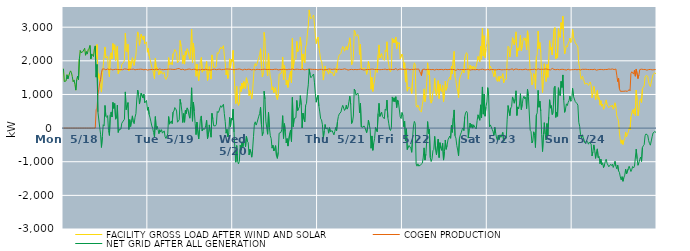
| Category | FACILITY GROSS LOAD AFTER WIND AND SOLAR | COGEN PRODUCTION | NET GRID AFTER ALL GENERATION |
|---|---|---|---|
|  Mon  5/18 | 1765 | 0 | 1765 |
|  Mon  5/18 | 1383 | 0 | 1383 |
|  Mon  5/18 | 1397 | 0 | 1397 |
|  Mon  5/18 | 1404 | 0 | 1404 |
|  Mon  5/18 | 1585 | 0 | 1585 |
|  Mon  5/18 | 1462 | 0 | 1462 |
|  Mon  5/18 | 1553 | 0 | 1553 |
|  Mon  5/18 | 1636 | 0 | 1636 |
|  Mon  5/18 | 1701 | 0 | 1701 |
|  Mon  5/18 | 1654 | 0 | 1654 |
|  Mon  5/18 | 1531 | 0 | 1531 |
|  Mon  5/18 | 1377 | 0 | 1377 |
|  Mon  5/18 | 1432 | 0 | 1432 |
|  Mon  5/18 | 1298 | 0 | 1298 |
|  Mon  5/18 | 1129 | 0 | 1129 |
|  Mon  5/18 | 1440 | 0 | 1440 |
|  Mon  5/18 | 1547 | 0 | 1547 |
|  Mon  5/18 | 1440 | 0 | 1440 |
|  Mon  5/18 | 2053 | 0 | 2053 |
|  Mon  5/18 | 2304 | 0 | 2304 |
|  Mon  5/18 | 2243 | 0 | 2243 |
|  Mon  5/18 | 2216 | 0 | 2216 |
|  Mon  5/18 | 2272 | 0 | 2272 |
|  Mon  5/18 | 2323 | 0 | 2323 |
|  Mon  5/18 | 2374 | 0 | 2374 |
|  Mon  5/18 | 2166 | 0 | 2166 |
|  Mon  5/18 | 2275 | 0 | 2275 |
|  Mon  5/18 | 2200 | 0 | 2200 |
|  Mon  5/18 | 2330 | 0 | 2330 |
|  Mon  5/18 | 2369 | 0 | 2369 |
|  Mon  5/18 | 2455 | 0 | 2455 |
|  Mon  5/18 | 2060 | 0 | 2060 |
|  Mon  5/18 | 2205 | 0 | 2205 |
|  Mon  5/18 | 2228 | 0 | 2228 |
|  Mon  5/18 | 2128 | 0 | 2128 |
|  Mon  5/18 | 2354 | 0 | 2354 |
|  Mon  5/18 | 2443 | 0 | 2443 |
|  Mon  5/18 | 2059 | 545 | 1514 |
|  Mon  5/18 | 2484 | 592 | 1892 |
|  Mon  5/18 | 1484 | 1001 | 483 |
|  Mon  5/18 | 1617 | 1158 | 459 |
|  Mon  5/18 | 1367 | 1338 | 29 |
|  Mon  5/18 | 1261 | 1442 | -181 |
|  Mon  5/18 | 1070 | 1645 | -575 |
|  Mon  5/18 | 1502 | 1757 | -255 |
|  Mon  5/18 | 1853 | 1753 | 100 |
|  Mon  5/18 | 1826 | 1758 | 68 |
|  Mon  5/18 | 2411 | 1738 | 673 |
|  Mon  5/18 | 2084 | 1733 | 351 |
|  Mon  5/18 | 2068 | 1749 | 319 |
|  Mon  5/18 | 2129 | 1758 | 371 |
|  Mon  5/18 | 1675 | 1753 | -78 |
|  Mon  5/18 | 1520 | 1738 | -218 |
|  Mon  5/18 | 2159 | 1764 | 395 |
|  Mon  5/18 | 2240 | 1760 | 480 |
|  Mon  5/18 | 2058 | 1729 | 329 |
|  Mon  5/18 | 2513 | 1750 | 763 |
|  Mon  5/18 | 2324 | 1739 | 585 |
|  Mon  5/18 | 2477 | 1747 | 730 |
|  Mon  5/18 | 2012 | 1749 | 263 |
|  Mon  5/18 | 2033 | 1732 | 301 |
|  Mon  5/18 | 2428 | 1745 | 683 |
|  Mon  5/18 | 1616 | 1744 | -128 |
|  Mon  5/18 | 1699 | 1738 | -39 |
|  Mon  5/18 | 1715 | 1740 | -25 |
|  Mon  5/18 | 1709 | 1740 | -31 |
|  Mon  5/18 | 1894 | 1749 | 145 |
|  Mon  5/18 | 1919 | 1735 | 184 |
|  Mon  5/18 | 1951 | 1754 | 197 |
|  Mon  5/18 | 2022 | 1759 | 263 |
|  Mon  5/18 | 2824 | 1748 | 1076 |
|  Mon  5/18 | 2303 | 1754 | 549 |
|  Mon  5/18 | 2263 | 1739 | 524 |
|  Mon  5/18 | 2498 | 1741 | 757 |
|  Mon  5/18 | 1697 | 1736 | -39 |
|  Mon  5/18 | 2001 | 1749 | 252 |
|  Mon  5/18 | 1773 | 1725 | 48 |
|  Mon  5/18 | 1971 | 1746 | 225 |
|  Mon  5/18 | 2093 | 1729 | 364 |
|  Mon  5/18 | 1930 | 1754 | 176 |
|  Mon  5/18 | 1863 | 1733 | 130 |
|  Mon  5/18 | 2057 | 1732 | 325 |
|  Mon  5/18 | 2175 | 1743 | 432 |
|  Mon  5/18 | 2607 | 1745 | 862 |
|  Mon  5/18 | 2860 | 1730 | 1130 |
|  Mon  5/18 | 2746 | 1746 | 1000 |
|  Mon  5/18 | 2462 | 1747 | 715 |
|  Mon  5/18 | 2468 | 1752 | 716 |
|  Mon  5/18 | 2790 | 1749 | 1041 |
|  Mon  5/18 | 2776 | 1748 | 1028 |
|  Mon  5/18 | 2628 | 1733 | 895 |
|  Mon  5/18 | 2741 | 1733 | 1008 |
|  Mon  5/18 | 2504 | 1752 | 752 |
|  Mon  5/18 | 2475 | 1745 | 730 |
|  Mon  5/18 | 2564 | 1743 | 821 |
|  Mon  5/18 | 2256 | 1726 | 530 |
|  Tue  5/19 | 2371 | 1748 | 623 |
|  Tue  5/19 | 2139 | 1736 | 403 |
|  Tue  5/19 | 2043 | 1740 | 303 |
|  Tue  5/19 | 1925 | 1740 | 185 |
|  Tue  5/19 | 1803 | 1739 | 64 |
|  Tue  5/19 | 1735 | 1745 | -10 |
|  Tue  5/19 | 1611 | 1745 | -134 |
|  Tue  5/19 | 1465 | 1737 | -272 |
|  Tue  5/19 | 2080 | 1739 | 341 |
|  Tue  5/19 | 1715 | 1754 | -39 |
|  Tue  5/19 | 1801 | 1750 | 51 |
|  Tue  5/19 | 1694 | 1738 | -44 |
|  Tue  5/19 | 1582 | 1747 | -165 |
|  Tue  5/19 | 1711 | 1759 | -48 |
|  Tue  5/19 | 1627 | 1746 | -119 |
|  Tue  5/19 | 1693 | 1739 | -46 |
|  Tue  5/19 | 1609 | 1760 | -151 |
|  Tue  5/19 | 1593 | 1737 | -144 |
|  Tue  5/19 | 1655 | 1738 | -83 |
|  Tue  5/19 | 1485 | 1744 | -259 |
|  Tue  5/19 | 1447 | 1755 | -308 |
|  Tue  5/19 | 1434 | 1743 | -309 |
|  Tue  5/19 | 1557 | 1730 | -173 |
|  Tue  5/19 | 2095 | 1752 | 343 |
|  Tue  5/19 | 1875 | 1759 | 116 |
|  Tue  5/19 | 1858 | 1751 | 107 |
|  Tue  5/19 | 1953 | 1741 | 212 |
|  Tue  5/19 | 1880 | 1747 | 133 |
|  Tue  5/19 | 2210 | 1735 | 475 |
|  Tue  5/19 | 2248 | 1742 | 506 |
|  Tue  5/19 | 2336 | 1726 | 610 |
|  Tue  5/19 | 2322 | 1746 | 576 |
|  Tue  5/19 | 2246 | 1739 | 507 |
|  Tue  5/19 | 1940 | 1765 | 175 |
|  Tue  5/19 | 1961 | 1758 | 203 |
|  Tue  5/19 | 2016 | 1769 | 247 |
|  Tue  5/19 | 2602 | 1746 | 856 |
|  Tue  5/19 | 2437 | 1736 | 701 |
|  Tue  5/19 | 2249 | 1745 | 504 |
|  Tue  5/19 | 1918 | 1751 | 167 |
|  Tue  5/19 | 2167 | 1735 | 432 |
|  Tue  5/19 | 1903 | 1729 | 174 |
|  Tue  5/19 | 2285 | 1749 | 536 |
|  Tue  5/19 | 2171 | 1737 | 434 |
|  Tue  5/19 | 2361 | 1760 | 601 |
|  Tue  5/19 | 2306 | 1752 | 554 |
|  Tue  5/19 | 2130 | 1753 | 377 |
|  Tue  5/19 | 2049 | 1755 | 294 |
|  Tue  5/19 | 2379 | 1748 | 631 |
|  Tue  5/19 | 2935 | 1737 | 1198 |
|  Tue  5/19 | 1946 | 1742 | 204 |
|  Tue  5/19 | 2522 | 1747 | 775 |
|  Tue  5/19 | 2259 | 1758 | 501 |
|  Tue  5/19 | 1882 | 1749 | 133 |
|  Tue  5/19 | 1538 | 1732 | -194 |
|  Tue  5/19 | 1902 | 1725 | 177 |
|  Tue  5/19 | 1926 | 1740 | 186 |
|  Tue  5/19 | 1415 | 1737 | -322 |
|  Tue  5/19 | 1709 | 1748 | -39 |
|  Tue  5/19 | 2014 | 1731 | 283 |
|  Tue  5/19 | 2100 | 1739 | 361 |
|  Tue  5/19 | 1661 | 1748 | -87 |
|  Tue  5/19 | 1726 | 1746 | -20 |
|  Tue  5/19 | 1741 | 1736 | 5 |
|  Tue  5/19 | 1702 | 1733 | -31 |
|  Tue  5/19 | 1834 | 1749 | 85 |
|  Tue  5/19 | 1982 | 1750 | 232 |
|  Tue  5/19 | 1418 | 1735 | -317 |
|  Tue  5/19 | 1555 | 1740 | -185 |
|  Tue  5/19 | 1827 | 1732 | 95 |
|  Tue  5/19 | 1635 | 1744 | -109 |
|  Tue  5/19 | 1456 | 1727 | -271 |
|  Tue  5/19 | 2176 | 1737 | 439 |
|  Tue  5/19 | 2024 | 1746 | 278 |
|  Tue  5/19 | 1804 | 1738 | 66 |
|  Tue  5/19 | 1817 | 1751 | 66 |
|  Tue  5/19 | 1806 | 1739 | 67 |
|  Tue  5/19 | 1849 | 1736 | 113 |
|  Tue  5/19 | 2244 | 1751 | 493 |
|  Tue  5/19 | 2209 | 1748 | 461 |
|  Tue  5/19 | 2259 | 1750 | 509 |
|  Tue  5/19 | 2355 | 1753 | 602 |
|  Tue  5/19 | 2407 | 1741 | 666 |
|  Tue  5/19 | 2351 | 1736 | 615 |
|  Tue  5/19 | 2373 | 1732 | 641 |
|  Tue  5/19 | 2450 | 1742 | 708 |
|  Tue  5/19 | 2159 | 1731 | 428 |
|  Tue  5/19 | 1950 | 1751 | 199 |
|  Tue  5/19 | 1583 | 1735 | -152 |
|  Tue  5/19 | 1719 | 1757 | -38 |
|  Tue  5/19 | 1477 | 1740 | -263 |
|  Tue  5/19 | 1595 | 1752 | -157 |
|  Tue  5/19 | 2060 | 1743 | 317 |
|  Tue  5/19 | 1791 | 1751 | 40 |
|  Tue  5/19 | 2043 | 1749 | 294 |
|  Tue  5/19 | 1981 | 1744 | 237 |
|  Wed  5/20 | 2308 | 1747 | 561 |
|  Wed  5/20 | 1620 | 1737 | -117 |
|  Wed  5/20 | 1107 | 1741 | -634 |
|  Wed  5/20 | 729 | 1744 | -1015 |
|  Wed  5/20 | 1238 | 1758 | -520 |
|  Wed  5/20 | 777 | 1750 | -973 |
|  Wed  5/20 | 674 | 1737 | -1063 |
|  Wed  5/20 | 774 | 1758 | -984 |
|  Wed  5/20 | 1237 | 1747 | -510 |
|  Wed  5/20 | 1085 | 1743 | -658 |
|  Wed  5/20 | 1338 | 1747 | -409 |
|  Wed  5/20 | 1173 | 1726 | -553 |
|  Wed  5/20 | 1382 | 1753 | -371 |
|  Wed  5/20 | 1411 | 1751 | -340 |
|  Wed  5/20 | 1176 | 1736 | -560 |
|  Wed  5/20 | 1496 | 1737 | -241 |
|  Wed  5/20 | 1369 | 1756 | -387 |
|  Wed  5/20 | 1317 | 1750 | -433 |
|  Wed  5/20 | 964 | 1762 | -798 |
|  Wed  5/20 | 1116 | 1747 | -631 |
|  Wed  5/20 | 1010 | 1741 | -731 |
|  Wed  5/20 | 866 | 1731 | -865 |
|  Wed  5/20 | 1107 | 1743 | -636 |
|  Wed  5/20 | 1490 | 1745 | -255 |
|  Wed  5/20 | 1858 | 1742 | 116 |
|  Wed  5/20 | 1918 | 1731 | 187 |
|  Wed  5/20 | 1844 | 1755 | 89 |
|  Wed  5/20 | 1910 | 1749 | 161 |
|  Wed  5/20 | 1885 | 1734 | 151 |
|  Wed  5/20 | 2095 | 1742 | 353 |
|  Wed  5/20 | 2184 | 1748 | 436 |
|  Wed  5/20 | 2359 | 1737 | 622 |
|  Wed  5/20 | 1833 | 1733 | 100 |
|  Wed  5/20 | 1520 | 1743 | -223 |
|  Wed  5/20 | 1633 | 1753 | -120 |
|  Wed  5/20 | 2846 | 1750 | 1096 |
|  Wed  5/20 | 2601 | 1735 | 866 |
|  Wed  5/20 | 1948 | 1745 | 203 |
|  Wed  5/20 | 1933 | 1747 | 186 |
|  Wed  5/20 | 1558 | 1741 | -183 |
|  Wed  5/20 | 2228 | 1752 | 476 |
|  Wed  5/20 | 1762 | 1745 | 17 |
|  Wed  5/20 | 1514 | 1741 | -227 |
|  Wed  5/20 | 1430 | 1741 | -311 |
|  Wed  5/20 | 1135 | 1731 | -596 |
|  Wed  5/20 | 1227 | 1738 | -511 |
|  Wed  5/20 | 1059 | 1738 | -679 |
|  Wed  5/20 | 1144 | 1749 | -605 |
|  Wed  5/20 | 1206 | 1727 | -521 |
|  Wed  5/20 | 923 | 1749 | -826 |
|  Wed  5/20 | 848 | 1749 | -901 |
|  Wed  5/20 | 1012 | 1730 | -718 |
|  Wed  5/20 | 1602 | 1756 | -154 |
|  Wed  5/20 | 1599 | 1738 | -139 |
|  Wed  5/20 | 1622 | 1752 | -130 |
|  Wed  5/20 | 1688 | 1741 | -53 |
|  Wed  5/20 | 2114 | 1745 | 369 |
|  Wed  5/20 | 1441 | 1749 | -308 |
|  Wed  5/20 | 1861 | 1728 | 133 |
|  Wed  5/20 | 1638 | 1744 | -106 |
|  Wed  5/20 | 1284 | 1724 | -440 |
|  Wed  5/20 | 1423 | 1734 | -311 |
|  Wed  5/20 | 1209 | 1744 | -535 |
|  Wed  5/20 | 1207 | 1750 | -543 |
|  Wed  5/20 | 1579 | 1734 | -155 |
|  Wed  5/20 | 1688 | 1743 | -55 |
|  Wed  5/20 | 1342 | 1741 | -399 |
|  Wed  5/20 | 2670 | 1755 | 915 |
|  Wed  5/20 | 1773 | 1729 | 44 |
|  Wed  5/20 | 2019 | 1735 | 284 |
|  Wed  5/20 | 2045 | 1738 | 307 |
|  Wed  5/20 | 2059 | 1751 | 308 |
|  Wed  5/20 | 2577 | 1755 | 822 |
|  Wed  5/20 | 2272 | 1750 | 522 |
|  Wed  5/20 | 2330 | 1749 | 581 |
|  Wed  5/20 | 2377 | 1743 | 634 |
|  Wed  5/20 | 2707 | 1743 | 964 |
|  Wed  5/20 | 2431 | 1740 | 691 |
|  Wed  5/20 | 1743 | 1737 | 6 |
|  Wed  5/20 | 2205 | 1760 | 445 |
|  Wed  5/20 | 2006 | 1730 | 276 |
|  Wed  5/20 | 1937 | 1754 | 183 |
|  Wed  5/20 | 2414 | 1738 | 676 |
|  Wed  5/20 | 2475 | 1736 | 739 |
|  Wed  5/20 | 2823 | 1746 | 1077 |
|  Wed  5/20 | 3034 | 1748 | 1286 |
|  Wed  5/20 | 3513 | 1754 | 1759 |
|  Wed  5/20 | 3326 | 1737 | 1589 |
|  Wed  5/20 | 3248 | 1750 | 1498 |
|  Wed  5/20 | 3287 | 1752 | 1535 |
|  Wed  5/20 | 3317 | 1745 | 1572 |
|  Wed  5/20 | 3361 | 1753 | 1608 |
|  Wed  5/20 | 3090 | 1744 | 1346 |
|  Wed  5/20 | 2756 | 1735 | 1021 |
|  Wed  5/20 | 2513 | 1743 | 770 |
|  Wed  5/20 | 2648 | 1737 | 911 |
|  Thu  5/21 | 2708 | 1728 | 980 |
|  Thu  5/21 | 2383 | 1728 | 655 |
|  Thu  5/21 | 2226 | 1746 | 480 |
|  Thu  5/21 | 2030 | 1754 | 276 |
|  Thu  5/21 | 1991 | 1745 | 246 |
|  Thu  5/21 | 1824 | 1726 | 98 |
|  Thu  5/21 | 1428 | 1733 | -305 |
|  Thu  5/21 | 1662 | 1746 | -84 |
|  Thu  5/21 | 1843 | 1737 | 106 |
|  Thu  5/21 | 1702 | 1727 | -25 |
|  Thu  5/21 | 1735 | 1741 | -6 |
|  Thu  5/21 | 1742 | 1738 | 4 |
|  Thu  5/21 | 1604 | 1755 | -151 |
|  Thu  5/21 | 1764 | 1750 | 14 |
|  Thu  5/21 | 1649 | 1753 | -104 |
|  Thu  5/21 | 1665 | 1742 | -77 |
|  Thu  5/21 | 1664 | 1742 | -78 |
|  Thu  5/21 | 1647 | 1753 | -106 |
|  Thu  5/21 | 1549 | 1751 | -202 |
|  Thu  5/21 | 1640 | 1738 | -98 |
|  Thu  5/21 | 1766 | 1750 | 16 |
|  Thu  5/21 | 1657 | 1740 | -83 |
|  Thu  5/21 | 1928 | 1737 | 191 |
|  Thu  5/21 | 2091 | 1747 | 344 |
|  Thu  5/21 | 2169 | 1751 | 418 |
|  Thu  5/21 | 2140 | 1745 | 395 |
|  Thu  5/21 | 2224 | 1743 | 481 |
|  Thu  5/21 | 2350 | 1749 | 601 |
|  Thu  5/21 | 2423 | 1747 | 676 |
|  Thu  5/21 | 2380 | 1733 | 647 |
|  Thu  5/21 | 2286 | 1762 | 524 |
|  Thu  5/21 | 2306 | 1737 | 569 |
|  Thu  5/21 | 2427 | 1747 | 680 |
|  Thu  5/21 | 2320 | 1755 | 565 |
|  Thu  5/21 | 2348 | 1725 | 623 |
|  Thu  5/21 | 2521 | 1731 | 790 |
|  Thu  5/21 | 2684 | 1738 | 946 |
|  Thu  5/21 | 2427 | 1729 | 698 |
|  Thu  5/21 | 1878 | 1747 | 131 |
|  Thu  5/21 | 1916 | 1735 | 181 |
|  Thu  5/21 | 2094 | 1736 | 358 |
|  Thu  5/21 | 2904 | 1744 | 1160 |
|  Thu  5/21 | 2853 | 1744 | 1109 |
|  Thu  5/21 | 2733 | 1755 | 978 |
|  Thu  5/21 | 2725 | 1737 | 988 |
|  Thu  5/21 | 2779 | 1736 | 1043 |
|  Thu  5/21 | 2676 | 1744 | 932 |
|  Thu  5/21 | 2181 | 1732 | 449 |
|  Thu  5/21 | 2494 | 1753 | 741 |
|  Thu  5/21 | 1775 | 1742 | 33 |
|  Thu  5/21 | 1769 | 1740 | 29 |
|  Thu  5/21 | 1758 | 1731 | 27 |
|  Thu  5/21 | 1792 | 1726 | 66 |
|  Thu  5/21 | 1773 | 1754 | 19 |
|  Thu  5/21 | 1744 | 1738 | 6 |
|  Thu  5/21 | 1599 | 1736 | -137 |
|  Thu  5/21 | 1744 | 1743 | 1 |
|  Thu  5/21 | 1983 | 1745 | 238 |
|  Thu  5/21 | 1831 | 1739 | 92 |
|  Thu  5/21 | 1702 | 1735 | -33 |
|  Thu  5/21 | 1154 | 1753 | -599 |
|  Thu  5/21 | 1508 | 1741 | -233 |
|  Thu  5/21 | 1091 | 1752 | -661 |
|  Thu  5/21 | 1297 | 1750 | -453 |
|  Thu  5/21 | 1425 | 1741 | -316 |
|  Thu  5/21 | 1740 | 1723 | 17 |
|  Thu  5/21 | 1776 | 1741 | 35 |
|  Thu  5/21 | 1655 | 1761 | -106 |
|  Thu  5/21 | 2176 | 1742 | 434 |
|  Thu  5/21 | 2472 | 1735 | 737 |
|  Thu  5/21 | 2083 | 1736 | 347 |
|  Thu  5/21 | 2103 | 1737 | 366 |
|  Thu  5/21 | 2214 | 1741 | 473 |
|  Thu  5/21 | 2073 | 1733 | 340 |
|  Thu  5/21 | 2083 | 1744 | 339 |
|  Thu  5/21 | 2015 | 1737 | 278 |
|  Thu  5/21 | 2316 | 1754 | 562 |
|  Thu  5/21 | 2266 | 1738 | 528 |
|  Thu  5/21 | 2566 | 1734 | 832 |
|  Thu  5/21 | 2051 | 1740 | 311 |
|  Thu  5/21 | 1892 | 1748 | 144 |
|  Thu  5/21 | 1714 | 1741 | -27 |
|  Thu  5/21 | 1674 | 1746 | -72 |
|  Thu  5/21 | 1763 | 1751 | 12 |
|  Thu  5/21 | 2668 | 1742 | 926 |
|  Thu  5/21 | 2543 | 1750 | 793 |
|  Thu  5/21 | 2638 | 1737 | 901 |
|  Thu  5/21 | 2537 | 1753 | 784 |
|  Thu  5/21 | 2702 | 1770 | 932 |
|  Thu  5/21 | 2358 | 1748 | 610 |
|  Thu  5/21 | 2564 | 1728 | 836 |
|  Thu  5/21 | 2504 | 1738 | 766 |
|  Thu  5/21 | 2541 | 1750 | 791 |
|  Thu  5/21 | 2060 | 1725 | 335 |
|  Thu  5/21 | 2041 | 1757 | 284 |
|  Thu  5/21 | 2201 | 1738 | 463 |
|  Fri  5/22 | 2121 | 1745 | 376 |
|  Fri  5/22 | 1782 | 1739 | 43 |
|  Fri  5/22 | 1943 | 1744 | 199 |
|  Fri  5/22 | 1368 | 1754 | -386 |
|  Fri  5/22 | 1734 | 1752 | -18 |
|  Fri  5/22 | 1098 | 1735 | -637 |
|  Fri  5/22 | 1190 | 1751 | -561 |
|  Fri  5/22 | 1221 | 1739 | -518 |
|  Fri  5/22 | 1188 | 1734 | -546 |
|  Fri  5/22 | 1139 | 1737 | -598 |
|  Fri  5/22 | 1028 | 1748 | -720 |
|  Fri  5/22 | 1451 | 1729 | -278 |
|  Fri  5/22 | 1803 | 1740 | 63 |
|  Fri  5/22 | 1940 | 1741 | 199 |
|  Fri  5/22 | 1887 | 1752 | 135 |
|  Fri  5/22 | 670 | 1735 | -1065 |
|  Fri  5/22 | 619 | 1751 | -1132 |
|  Fri  5/22 | 685 | 1747 | -1062 |
|  Fri  5/22 | 624 | 1754 | -1130 |
|  Fri  5/22 | 526 | 1685 | -1159 |
|  Fri  5/22 | 539 | 1634 | -1095 |
|  Fri  5/22 | 481 | 1562 | -1081 |
|  Fri  5/22 | 691 | 1736 | -1045 |
|  Fri  5/22 | 850 | 1738 | -888 |
|  Fri  5/22 | 1166 | 1754 | -588 |
|  Fri  5/22 | 787 | 1739 | -952 |
|  Fri  5/22 | 961 | 1734 | -773 |
|  Fri  5/22 | 1386 | 1758 | -372 |
|  Fri  5/22 | 1940 | 1747 | 193 |
|  Fri  5/22 | 1581 | 1743 | -162 |
|  Fri  5/22 | 1707 | 1745 | -38 |
|  Fri  5/22 | 854 | 1732 | -878 |
|  Fri  5/22 | 742 | 1737 | -995 |
|  Fri  5/22 | 830 | 1742 | -912 |
|  Fri  5/22 | 1071 | 1743 | -672 |
|  Fri  5/22 | 1113 | 1748 | -635 |
|  Fri  5/22 | 1480 | 1727 | -247 |
|  Fri  5/22 | 1084 | 1729 | -645 |
|  Fri  5/22 | 950 | 1746 | -796 |
|  Fri  5/22 | 963 | 1739 | -776 |
|  Fri  5/22 | 1410 | 1737 | -327 |
|  Fri  5/22 | 880 | 1756 | -876 |
|  Fri  5/22 | 1308 | 1741 | -433 |
|  Fri  5/22 | 1133 | 1727 | -594 |
|  Fri  5/22 | 1081 | 1744 | -663 |
|  Fri  5/22 | 1272 | 1725 | -453 |
|  Fri  5/22 | 781 | 1732 | -951 |
|  Fri  5/22 | 1044 | 1749 | -705 |
|  Fri  5/22 | 1394 | 1748 | -354 |
|  Fri  5/22 | 1125 | 1757 | -632 |
|  Fri  5/22 | 1223 | 1737 | -514 |
|  Fri  5/22 | 1392 | 1744 | -352 |
|  Fri  5/22 | 1416 | 1742 | -326 |
|  Fri  5/22 | 1519 | 1756 | -237 |
|  Fri  5/22 | 1443 | 1747 | -304 |
|  Fri  5/22 | 1838 | 1749 | 89 |
|  Fri  5/22 | 1617 | 1743 | -126 |
|  Fri  5/22 | 2035 | 1739 | 296 |
|  Fri  5/22 | 2280 | 1740 | 540 |
|  Fri  5/22 | 1511 | 1741 | -230 |
|  Fri  5/22 | 1416 | 1714 | -298 |
|  Fri  5/22 | 1205 | 1720 | -515 |
|  Fri  5/22 | 1098 | 1750 | -652 |
|  Fri  5/22 | 910 | 1736 | -826 |
|  Fri  5/22 | 1432 | 1735 | -303 |
|  Fri  5/22 | 1538 | 1739 | -201 |
|  Fri  5/22 | 1603 | 1740 | -137 |
|  Fri  5/22 | 1691 | 1740 | -49 |
|  Fri  5/22 | 1746 | 1743 | 3 |
|  Fri  5/22 | 1643 | 1718 | -75 |
|  Fri  5/22 | 2079 | 1738 | 341 |
|  Fri  5/22 | 2181 | 1721 | 460 |
|  Fri  5/22 | 2243 | 1744 | 499 |
|  Fri  5/22 | 2191 | 1746 | 445 |
|  Fri  5/22 | 1456 | 1752 | -296 |
|  Fri  5/22 | 1730 | 1744 | -14 |
|  Fri  5/22 | 1874 | 1725 | 149 |
|  Fri  5/22 | 1762 | 1746 | 16 |
|  Fri  5/22 | 1847 | 1737 | 110 |
|  Fri  5/22 | 1742 | 1743 | -1 |
|  Fri  5/22 | 1835 | 1739 | 96 |
|  Fri  5/22 | 1828 | 1750 | 78 |
|  Fri  5/22 | 1739 | 1734 | 5 |
|  Fri  5/22 | 1717 | 1743 | -26 |
|  Fri  5/22 | 1966 | 1746 | 220 |
|  Fri  5/22 | 2130 | 1735 | 395 |
|  Fri  5/22 | 2133 | 1729 | 404 |
|  Fri  5/22 | 1973 | 1739 | 234 |
|  Fri  5/22 | 2434 | 1743 | 691 |
|  Fri  5/22 | 2046 | 1738 | 308 |
|  Fri  5/22 | 2975 | 1752 | 1223 |
|  Fri  5/22 | 2143 | 1729 | 414 |
|  Fri  5/22 | 2747 | 1736 | 1011 |
|  Fri  5/22 | 2095 | 1742 | 353 |
|  Fri  5/22 | 2353 | 1729 | 624 |
|  Fri  5/22 | 2523 | 1746 | 777 |
|  Sat  5/23 | 2952 | 1750 | 1202 |
|  Sat  5/23 | 2722 | 1737 | 985 |
|  Sat  5/23 | 1773 | 1729 | 44 |
|  Sat  5/23 | 1844 | 1750 | 94 |
|  Sat  5/23 | 1850 | 1741 | 109 |
|  Sat  5/23 | 1712 | 1746 | -34 |
|  Sat  5/23 | 1632 | 1740 | -108 |
|  Sat  5/23 | 1527 | 1738 | -211 |
|  Sat  5/23 | 1752 | 1731 | 21 |
|  Sat  5/23 | 1587 | 1741 | -154 |
|  Sat  5/23 | 1437 | 1733 | -296 |
|  Sat  5/23 | 1387 | 1755 | -368 |
|  Sat  5/23 | 1531 | 1745 | -214 |
|  Sat  5/23 | 1392 | 1731 | -339 |
|  Sat  5/23 | 1540 | 1741 | -201 |
|  Sat  5/23 | 1480 | 1753 | -273 |
|  Sat  5/23 | 1532 | 1732 | -200 |
|  Sat  5/23 | 1617 | 1744 | -127 |
|  Sat  5/23 | 1346 | 1738 | -392 |
|  Sat  5/23 | 1433 | 1751 | -318 |
|  Sat  5/23 | 1407 | 1737 | -330 |
|  Sat  5/23 | 1454 | 1754 | -300 |
|  Sat  5/23 | 2011 | 1748 | 263 |
|  Sat  5/23 | 2434 | 1764 | 670 |
|  Sat  5/23 | 2397 | 1732 | 665 |
|  Sat  5/23 | 2115 | 1744 | 371 |
|  Sat  5/23 | 2344 | 1747 | 597 |
|  Sat  5/23 | 2374 | 1738 | 636 |
|  Sat  5/23 | 2689 | 1763 | 926 |
|  Sat  5/23 | 2564 | 1722 | 842 |
|  Sat  5/23 | 2472 | 1733 | 739 |
|  Sat  5/23 | 2618 | 1755 | 863 |
|  Sat  5/23 | 2861 | 1752 | 1109 |
|  Sat  5/23 | 2128 | 1753 | 375 |
|  Sat  5/23 | 2377 | 1748 | 629 |
|  Sat  5/23 | 2304 | 1736 | 568 |
|  Sat  5/23 | 2459 | 1741 | 718 |
|  Sat  5/23 | 2766 | 1744 | 1022 |
|  Sat  5/23 | 2299 | 1748 | 551 |
|  Sat  5/23 | 2442 | 1735 | 707 |
|  Sat  5/23 | 2631 | 1749 | 882 |
|  Sat  5/23 | 2687 | 1741 | 946 |
|  Sat  5/23 | 2608 | 1741 | 867 |
|  Sat  5/23 | 2671 | 1754 | 917 |
|  Sat  5/23 | 2321 | 1743 | 578 |
|  Sat  5/23 | 2891 | 1734 | 1157 |
|  Sat  5/23 | 2687 | 1739 | 948 |
|  Sat  5/23 | 2665 | 1735 | 930 |
|  Sat  5/23 | 1684 | 1747 | -63 |
|  Sat  5/23 | 1634 | 1740 | -106 |
|  Sat  5/23 | 1287 | 1729 | -442 |
|  Sat  5/23 | 1359 | 1743 | -384 |
|  Sat  5/23 | 1620 | 1731 | -111 |
|  Sat  5/23 | 1534 | 1751 | -217 |
|  Sat  5/23 | 1167 | 1744 | -577 |
|  Sat  5/23 | 2117 | 1732 | 385 |
|  Sat  5/23 | 2191 | 1736 | 455 |
|  Sat  5/23 | 2881 | 1761 | 1120 |
|  Sat  5/23 | 2360 | 1740 | 620 |
|  Sat  5/23 | 2543 | 1743 | 800 |
|  Sat  5/23 | 2259 | 1752 | 507 |
|  Sat  5/23 | 1561 | 1749 | -188 |
|  Sat  5/23 | 1059 | 1755 | -696 |
|  Sat  5/23 | 1546 | 1746 | -200 |
|  Sat  5/23 | 1912 | 1751 | 161 |
|  Sat  5/23 | 1577 | 1755 | -178 |
|  Sat  5/23 | 1384 | 1738 | -354 |
|  Sat  5/23 | 1891 | 1755 | 136 |
|  Sat  5/23 | 1509 | 1742 | -233 |
|  Sat  5/23 | 2065 | 1737 | 328 |
|  Sat  5/23 | 2598 | 1755 | 843 |
|  Sat  5/23 | 2323 | 1730 | 593 |
|  Sat  5/23 | 2400 | 1733 | 667 |
|  Sat  5/23 | 2174 | 1774 | 400 |
|  Sat  5/23 | 2199 | 1745 | 454 |
|  Sat  5/23 | 2935 | 1742 | 1193 |
|  Sat  5/23 | 2988 | 1745 | 1243 |
|  Sat  5/23 | 2054 | 1735 | 319 |
|  Sat  5/23 | 2214 | 1741 | 473 |
|  Sat  5/23 | 2097 | 1746 | 351 |
|  Sat  5/23 | 2954 | 1755 | 1199 |
|  Sat  5/23 | 2769 | 1734 | 1035 |
|  Sat  5/23 | 2692 | 1734 | 958 |
|  Sat  5/23 | 3135 | 1746 | 1389 |
|  Sat  5/23 | 2954 | 1746 | 1208 |
|  Sat  5/23 | 3327 | 1747 | 1580 |
|  Sat  5/23 | 2571 | 1741 | 830 |
|  Sat  5/23 | 2204 | 1736 | 468 |
|  Sat  5/23 | 2314 | 1748 | 566 |
|  Sat  5/23 | 2448 | 1727 | 721 |
|  Sat  5/23 | 2411 | 1742 | 669 |
|  Sat  5/23 | 2514 | 1751 | 763 |
|  Sat  5/23 | 2575 | 1753 | 822 |
|  Sat  5/23 | 2678 | 1729 | 949 |
|  Sat  5/23 | 2543 | 1746 | 797 |
|  Sat  5/23 | 2580 | 1736 | 844 |
|  Sun  5/24 | 2936 | 1754 | 1182 |
|  Sun  5/24 | 2682 | 1738 | 944 |
|  Sun  5/24 | 2643 | 1720 | 923 |
|  Sun  5/24 | 2534 | 1746 | 788 |
|  Sun  5/24 | 2547 | 1744 | 803 |
|  Sun  5/24 | 2461 | 1734 | 727 |
|  Sun  5/24 | 2411 | 1731 | 680 |
|  Sun  5/24 | 1918 | 1746 | 172 |
|  Sun  5/24 | 1797 | 1746 | 51 |
|  Sun  5/24 | 1530 | 1728 | -198 |
|  Sun  5/24 | 1445 | 1744 | -299 |
|  Sun  5/24 | 1548 | 1748 | -200 |
|  Sun  5/24 | 1475 | 1748 | -273 |
|  Sun  5/24 | 1479 | 1746 | -267 |
|  Sun  5/24 | 1302 | 1746 | -444 |
|  Sun  5/24 | 1333 | 1749 | -416 |
|  Sun  5/24 | 1362 | 1738 | -376 |
|  Sun  5/24 | 1319 | 1741 | -422 |
|  Sun  5/24 | 1269 | 1748 | -479 |
|  Sun  5/24 | 1323 | 1739 | -416 |
|  Sun  5/24 | 1372 | 1762 | -390 |
|  Sun  5/24 | 1268 | 1743 | -475 |
|  Sun  5/24 | 904 | 1732 | -828 |
|  Sun  5/24 | 1035 | 1738 | -703 |
|  Sun  5/24 | 1239 | 1739 | -500 |
|  Sun  5/24 | 1087 | 1748 | -661 |
|  Sun  5/24 | 846 | 1746 | -900 |
|  Sun  5/24 | 1025 | 1723 | -698 |
|  Sun  5/24 | 1121 | 1738 | -617 |
|  Sun  5/24 | 855 | 1736 | -881 |
|  Sun  5/24 | 905 | 1748 | -843 |
|  Sun  5/24 | 683 | 1744 | -1061 |
|  Sun  5/24 | 815 | 1740 | -925 |
|  Sun  5/24 | 648 | 1742 | -1094 |
|  Sun  5/24 | 715 | 1746 | -1031 |
|  Sun  5/24 | 559 | 1735 | -1176 |
|  Sun  5/24 | 638 | 1736 | -1098 |
|  Sun  5/24 | 748 | 1742 | -994 |
|  Sun  5/24 | 837 | 1763 | -926 |
|  Sun  5/24 | 697 | 1741 | -1044 |
|  Sun  5/24 | 717 | 1740 | -1023 |
|  Sun  5/24 | 606 | 1756 | -1150 |
|  Sun  5/24 | 579 | 1740 | -1161 |
|  Sun  5/24 | 668 | 1747 | -1079 |
|  Sun  5/24 | 632 | 1743 | -1111 |
|  Sun  5/24 | 685 | 1758 | -1073 |
|  Sun  5/24 | 563 | 1733 | -1170 |
|  Sun  5/24 | 645 | 1739 | -1094 |
|  Sun  5/24 | 751 | 1740 | -989 |
|  Sun  5/24 | 628 | 1756 | -1128 |
|  Sun  5/24 | 362 | 1573 | -1211 |
|  Sun  5/24 | 287 | 1385 | -1098 |
|  Sun  5/24 | 213 | 1488 | -1275 |
|  Sun  5/24 | -149 | 1170 | -1319 |
|  Sun  5/24 | -357 | 1095 | -1452 |
|  Sun  5/24 | -457 | 1084 | -1541 |
|  Sun  5/24 | -350 | 1093 | -1443 |
|  Sun  5/24 | -486 | 1095 | -1581 |
|  Sun  5/24 | -375 | 1095 | -1470 |
|  Sun  5/24 | -312 | 1088 | -1400 |
|  Sun  5/24 | -120 | 1102 | -1222 |
|  Sun  5/24 | -259 | 1106 | -1365 |
|  Sun  5/24 | -257 | 1091 | -1348 |
|  Sun  5/24 | -117 | 1090 | -1207 |
|  Sun  5/24 | 11 | 1146 | -1135 |
|  Sun  5/24 | -54 | 1108 | -1162 |
|  Sun  5/24 | 332 | 1623 | -1291 |
|  Sun  5/24 | 449 | 1675 | -1226 |
|  Sun  5/24 | 545 | 1686 | -1141 |
|  Sun  5/24 | 422 | 1605 | -1183 |
|  Sun  5/24 | 578 | 1718 | -1140 |
|  Sun  5/24 | 375 | 1542 | -1167 |
|  Sun  5/24 | 1130 | 1757 | -627 |
|  Sun  5/24 | 833 | 1745 | -912 |
|  Sun  5/24 | 368 | 1473 | -1105 |
|  Sun  5/24 | 553 | 1580 | -1027 |
|  Sun  5/24 | 812 | 1740 | -928 |
|  Sun  5/24 | 868 | 1729 | -861 |
|  Sun  5/24 | 760 | 1752 | -992 |
|  Sun  5/24 | 1171 | 1748 | -577 |
|  Sun  5/24 | 1216 | 1741 | -525 |
|  Sun  5/24 | 1254 | 1745 | -491 |
|  Sun  5/24 | 1514 | 1743 | -229 |
|  Sun  5/24 | 1562 | 1736 | -174 |
|  Sun  5/24 | 1540 | 1722 | -182 |
|  Sun  5/24 | 1538 | 1750 | -212 |
|  Sun  5/24 | 1374 | 1739 | -365 |
|  Sun  5/24 | 1285 | 1743 | -458 |
|  Sun  5/24 | 1236 | 1744 | -508 |
|  Sun  5/24 | 1227 | 1736 | -509 |
|  Sun  5/24 | 1473 | 1731 | -258 |
|  Sun  5/24 | 1594 | 1741 | -147 |
|  Sun  5/24 | 1591 | 1735 | -144 |
|  Sun  5/24 | 1645 | 1748 | -103 |
|  Sun  5/24 | 1624 | 1740 | -116 |
|  Sun  5/24 | 1594 | 1737 | -143 |